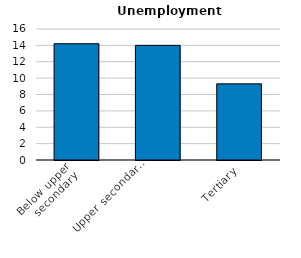
| Category | Portugal |
|---|---|
| Below upper
secondary | 14.2 |
| Upper secondary
and post-secondary 
non-tertiary | 14 |
| Tertiary | 9.3 |